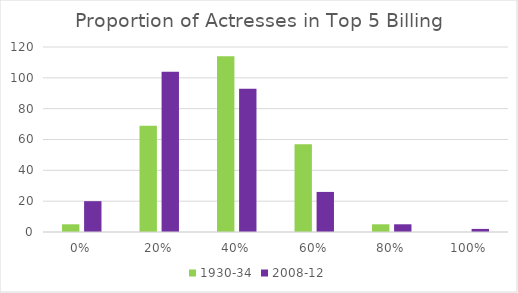
| Category | 1930-34 | 2008-12 |
|---|---|---|
| 0.0 | 5 | 20 |
| 0.2 | 69 | 104 |
| 0.4 | 114 | 93 |
| 0.6 | 57 | 26 |
| 0.8 | 5 | 5 |
| 1.0 | 0 | 2 |